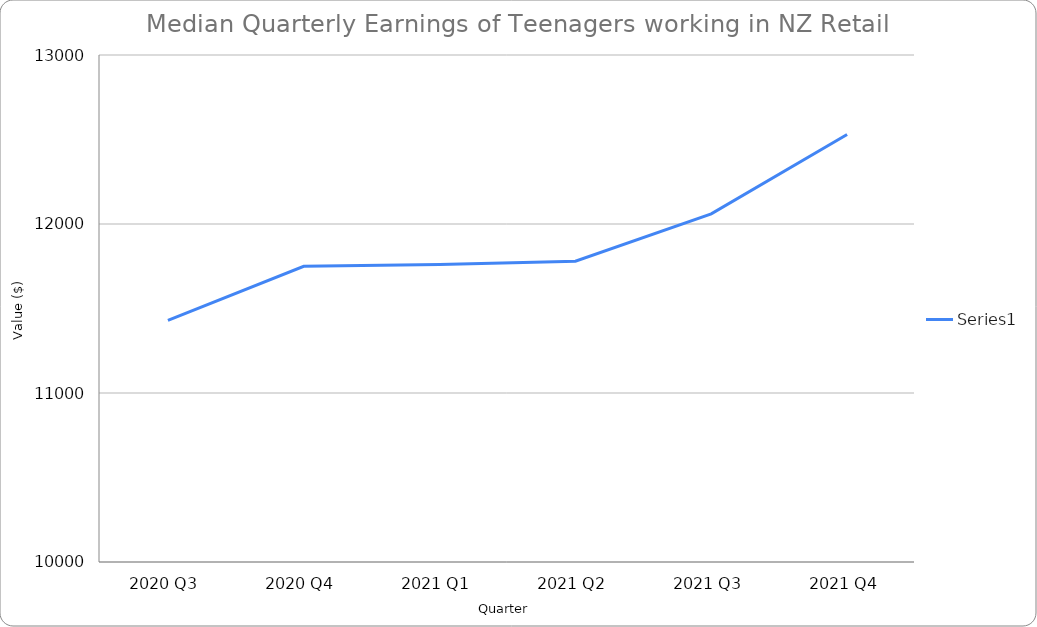
| Category | Series 0 |
|---|---|
| 2020 Q3 | 11430 |
| 2020 Q4 | 11750 |
| 2021 Q1 | 11760 |
| 2021 Q2 | 11780 |
| 2021 Q3 | 12060 |
| 2021 Q4 | 12530 |